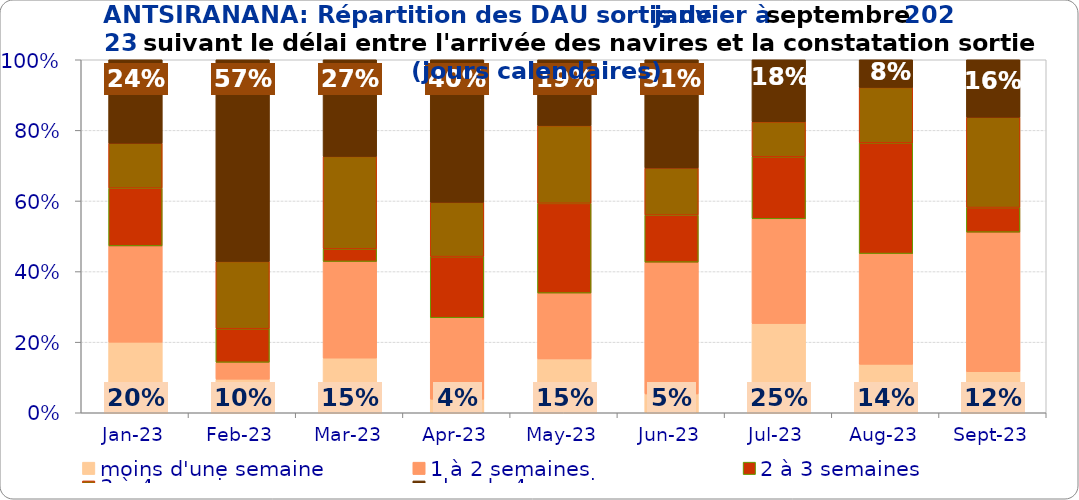
| Category | moins d'une semaine | 1 à 2 semaines | 2 à 3 semaines | 3 à 4 semaines | plus de 4 semaines |
|---|---|---|---|---|---|
| 2023-01-01 | 0.2 | 0.273 | 0.164 | 0.127 | 0.236 |
| 2023-02-01 | 0.095 | 0.048 | 0.095 | 0.19 | 0.571 |
| 2023-03-01 | 0.155 | 0.274 | 0.036 | 0.262 | 0.274 |
| 2023-04-01 | 0.038 | 0.231 | 0.173 | 0.154 | 0.404 |
| 2023-05-01 | 0.153 | 0.186 | 0.254 | 0.22 | 0.186 |
| 2023-06-01 | 0.053 | 0.373 | 0.133 | 0.133 | 0.307 |
| 2023-07-01 | 0.253 | 0.297 | 0.176 | 0.099 | 0.176 |
| 2023-08-01 | 0.137 | 0.314 | 0.314 | 0.157 | 0.078 |
| 2023-09-01 | 0.116 | 0.395 | 0.07 | 0.256 | 0.163 |